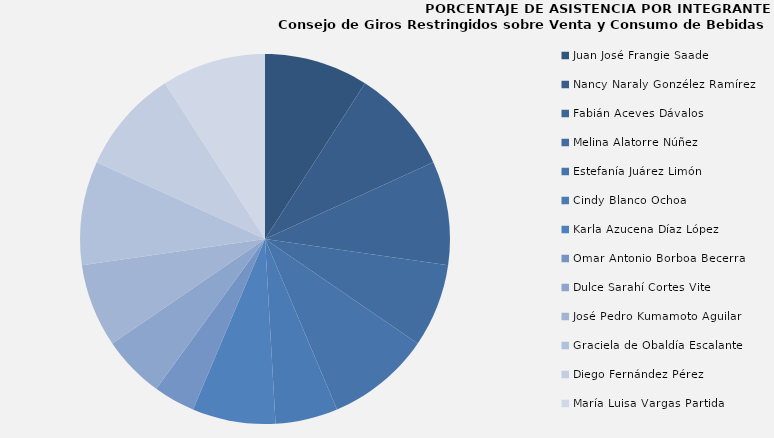
| Category | Series 0 |
|---|---|
| Juan José Frangie Saade | 100 |
| Nancy Naraly Gonzélez Ramírez | 100 |
| Fabián Aceves Dávalos  | 100 |
| Melina Alatorre Núñez  | 80 |
| Estefanía Juárez Limón | 100 |
| Cindy Blanco Ochoa | 60 |
| Karla Azucena Díaz López | 80 |
| Omar Antonio Borboa Becerra | 40 |
| Dulce Sarahí Cortes Vite | 60 |
| José Pedro Kumamoto Aguilar | 80 |
| Graciela de Obaldía Escalante | 100 |
| Diego Fernández Pérez | 100 |
| María Luisa Vargas Partida | 100 |